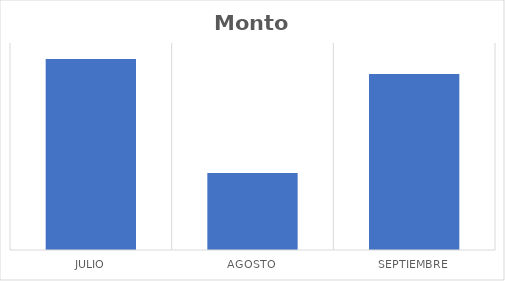
| Category | Monto Cobrado |
|---|---|
| Julio | 12630647 |
| Agosto | 12134508.5 |
| Septiembre | 12565198.5 |